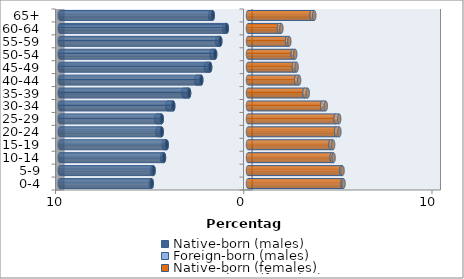
| Category | Native-born (males) | Foreign-born (males) | Native-born (females) | Foreign-born (females) |
|---|---|---|---|---|
| 0-4 | -5.115 | -0.051 | 5.019 | 0.057 |
| 5-9 | -5.017 | -0.07 | 4.95 | 0.073 |
| 10-14 | -4.463 | -0.102 | 4.448 | 0.097 |
| 15-19 | -4.32 | -0.156 | 4.388 | 0.134 |
| 20-24 | -4.585 | -0.226 | 4.682 | 0.173 |
| 25-29 | -4.583 | -0.29 | 4.649 | 0.196 |
| 30-34 | -3.971 | -0.314 | 3.94 | 0.191 |
| 35-39 | -3.13 | -0.299 | 3.001 | 0.174 |
| 40-44 | -2.483 | -0.266 | 2.559 | 0.156 |
| 45-49 | -2.012 | -0.231 | 2.439 | 0.142 |
| 50-54 | -1.745 | -0.195 | 2.38 | 0.13 |
| 55-59 | -1.474 | -0.159 | 2.074 | 0.119 |
| 60-64 | -1.127 | -0.142 | 1.648 | 0.125 |
| 65+ | -1.875 | -0.137 | 3.378 | 0.142 |